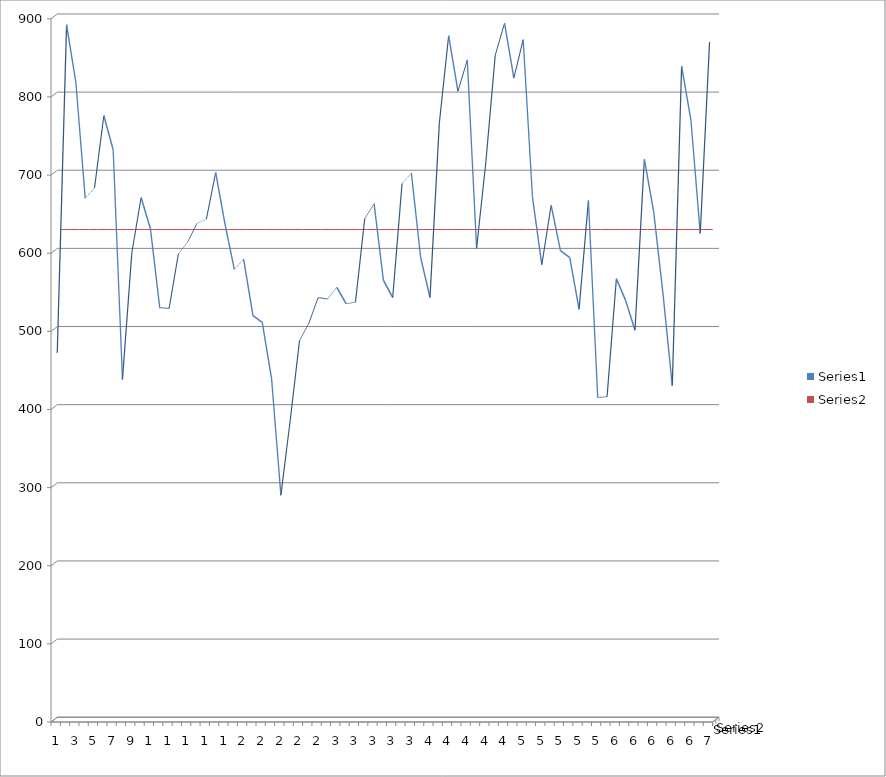
| Category | Series 0 | Series 1 |
|---|---|---|
| 0 | 470 | 624.944 |
| 1 | 890 | 624.944 |
| 2 | 816 | 624.944 |
| 3 | 668 | 624.944 |
| 4 | 681 | 624.944 |
| 5 | 774 | 624.944 |
| 6 | 730 | 624.944 |
| 7 | 436 | 624.944 |
| 8 | 598 | 624.944 |
| 9 | 669 | 624.944 |
| 10 | 629 | 624.944 |
| 11 | 528 | 624.944 |
| 12 | 527 | 624.944 |
| 13 | 597 | 624.944 |
| 14 | 612 | 624.944 |
| 15 | 636 | 624.944 |
| 16 | 641 | 624.944 |
| 17 | 701 | 624.944 |
| 18 | 635 | 624.944 |
| 19 | 577 | 624.944 |
| 20 | 590 | 624.944 |
| 21 | 518 | 624.944 |
| 22 | 509 | 624.944 |
| 23 | 437 | 624.944 |
| 24 | 288 | 624.944 |
| 25 | 384 | 624.944 |
| 26 | 486 | 624.944 |
| 27 | 508 | 624.944 |
| 28 | 541 | 624.944 |
| 29 | 539 | 624.944 |
| 30 | 554 | 624.944 |
| 31 | 533 | 624.944 |
| 32 | 535 | 624.944 |
| 33 | 642 | 624.944 |
| 34 | 661 | 624.944 |
| 35 | 563 | 624.944 |
| 36 | 541 | 624.944 |
| 37 | 687 | 624.944 |
| 38 | 700 | 624.944 |
| 39 | 592 | 624.944 |
| 40 | 541 | 624.944 |
| 41 | 764 | 624.944 |
| 42 | 876 | 624.944 |
| 43 | 805 | 624.944 |
| 44 | 845 | 624.944 |
| 45 | 604 | 624.944 |
| 46 | 715 | 624.944 |
| 47 | 851 | 624.944 |
| 48 | 892 | 624.944 |
| 49 | 822 | 624.944 |
| 50 | 871 | 624.944 |
| 51 | 669 | 624.944 |
| 52 | 583 | 624.944 |
| 53 | 659 | 624.944 |
| 54 | 601 | 624.944 |
| 55 | 592 | 624.944 |
| 56 | 526 | 624.944 |
| 57 | 665 | 624.944 |
| 58 | 413 | 624.944 |
| 59 | 414 | 624.944 |
| 60 | 565 | 624.944 |
| 61 | 537 | 624.944 |
| 62 | 499 | 624.944 |
| 63 | 718 | 624.944 |
| 64 | 651 | 624.944 |
| 65 | 546 | 624.944 |
| 66 | 428 | 624.944 |
| 67 | 837 | 624.944 |
| 68 | 768 | 624.944 |
| 69 | 623 | 624.944 |
| 70 | 868 | 624.944 |